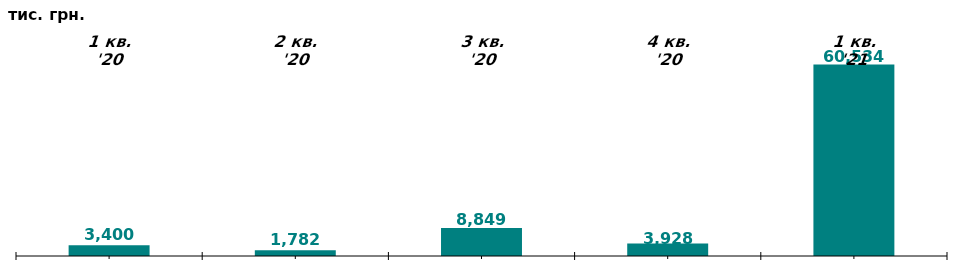
| Category | Чистий притік/відтік капіталу у 1-му кв. 2020-21 рр, тис. грн 0 0 |
|---|---|
| 1 кв. '20 | 3400.023 |
| 2 кв. '20 | 1781.633 |
| 3 кв. '20 | 8849.263 |
| 4 кв. '20 | 3928.167 |
| 1 кв. '21 | 60533.895 |